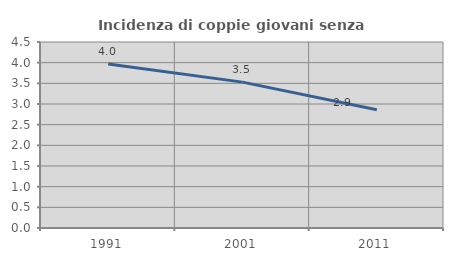
| Category | Incidenza di coppie giovani senza figli |
|---|---|
| 1991.0 | 3.967 |
| 2001.0 | 3.529 |
| 2011.0 | 2.86 |